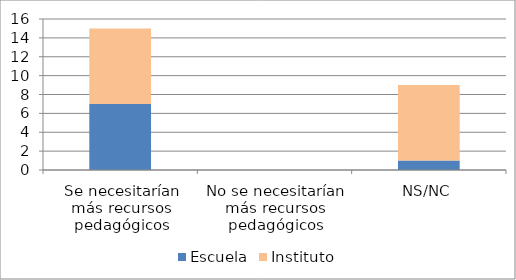
| Category | Escuela | Instituto |
|---|---|---|
| Se necesitarían más recursos pedagógicos | 7 | 8 |
| No se necesitarían más recursos pedagógicos | 0 | 0 |
| NS/NC | 1 | 8 |